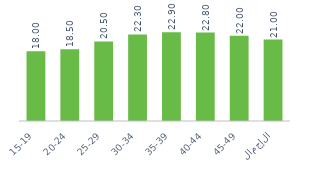
| Category | Series 0 |
|---|---|
| 15-19 | 18 |
| 20-24 | 18.5 |
| 25-29 | 20.5 |
| 30-34 | 22.3 |
| 35-39 | 22.9 |
| 40-44 | 22.8 |
| 45-49 | 22 |
| الإجمالي | 21 |